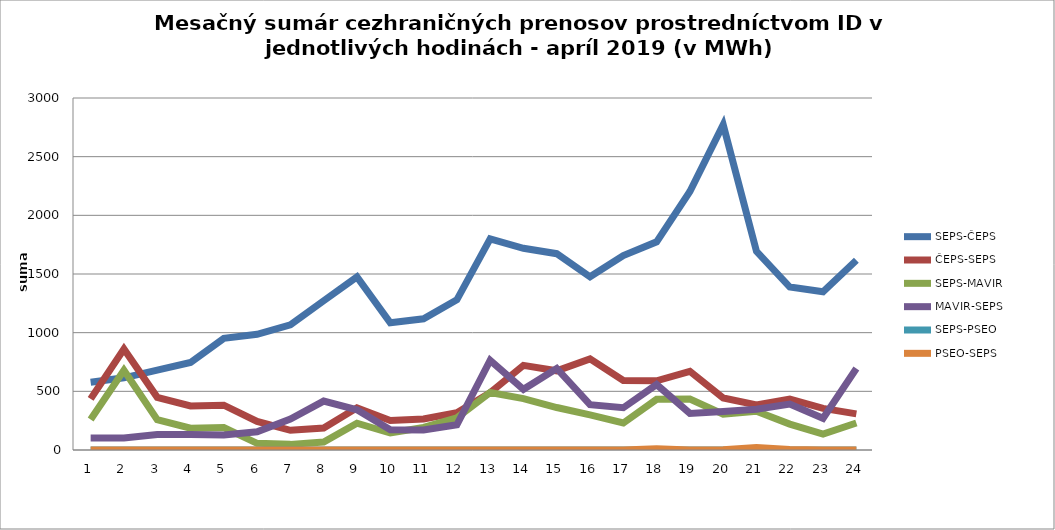
| Category | SEPS-ČEPS | ČEPS-SEPS | SEPS-MAVIR | MAVIR-SEPS | SEPS-PSEO | PSEO-SEPS |
|---|---|---|---|---|---|---|
| 1.0 | 578 | 436 | 260 | 102 | 0 | 0 |
| 2.0 | 615 | 860 | 679 | 102 | 0 | 0 |
| 3.0 | 680 | 449 | 258 | 132 | 0 | 0 |
| 4.0 | 746 | 376 | 186 | 132 | 0 | 0 |
| 5.0 | 952 | 382 | 191 | 127 | 0 | 0 |
| 6.0 | 986 | 244 | 57 | 156 | 0 | 0 |
| 7.0 | 1067 | 168 | 48 | 264 | 0 | 0 |
| 8.0 | 1272 | 187 | 68 | 417 | 0 | 0 |
| 9.0 | 1475 | 359 | 228 | 343 | 0 | 0 |
| 10.0 | 1085 | 251 | 145 | 172 | 0 | 0 |
| 11.0 | 1118 | 265 | 192 | 171 | 0 | 0 |
| 12.0 | 1280 | 318 | 274 | 215 | 0 | 0 |
| 13.0 | 1799 | 489 | 490 | 764 | 0 | 0 |
| 14.0 | 1719 | 721 | 438 | 517 | 0 | 0 |
| 15.0 | 1673 | 675 | 362 | 695 | 0 | 0 |
| 16.0 | 1476 | 777 | 299 | 386 | 0 | 0 |
| 17.0 | 1657 | 593 | 230 | 360 | 0 | 0 |
| 18.0 | 1774 | 590 | 432 | 558 | 0 | 10 |
| 19.0 | 2203 | 671 | 434 | 311 | 0 | 0 |
| 20.0 | 2772 | 444 | 305 | 329 | 0 | 2 |
| 21.0 | 1693 | 385 | 330 | 348 | 0 | 22 |
| 22.0 | 1389 | 434 | 221 | 392 | 0 | 5 |
| 23.0 | 1348 | 355 | 136 | 270 | 0 | 0 |
| 24.0 | 1617 | 308 | 230 | 694 | 0 | 0 |